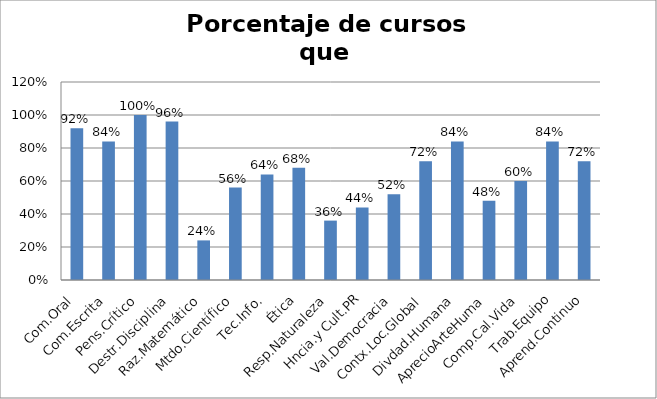
| Category | Series 0 |
|---|---|
| Com.Oral | 0.92 |
| Com.Escrita | 0.84 |
| Pens.Crítico | 1 |
| Destr.Disciplina | 0.96 |
| Raz.Matemático | 0.24 |
| Mtdo.Científico | 0.56 |
| Tec.Info. | 0.64 |
| Ética | 0.68 |
| Resp.Naturaleza | 0.36 |
| Hncia.y Cult.PR | 0.44 |
| Val.Democracia | 0.52 |
| Contx.Loc.Global | 0.72 |
| Divdad.Humana | 0.84 |
| AprecioArteHuma | 0.48 |
| Comp.Cal.Vida | 0.6 |
| Trab.Equipo | 0.84 |
| Aprend.Continuo | 0.72 |